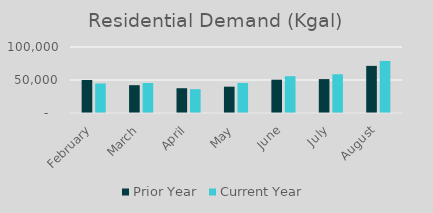
| Category | Prior Year | Current Year |
|---|---|---|
| February | 49996 | 44769 |
| March | 42168 | 45502 |
| April | 37537 | 36081 |
| May | 39883 | 45570 |
| June | 50498 | 55783 |
| July | 51383 | 58740 |
| August | 71400 | 78887 |